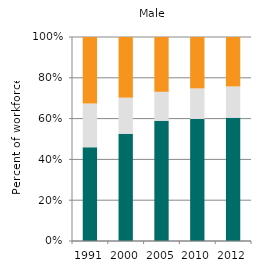
| Category | Agriculture | Industry | Services |
|---|---|---|---|
| 1991.0 | 45.932 | 21.459 | 32.609 |
| 2000.0 | 52.572 | 17.708 | 29.721 |
| 2005.0 | 58.965 | 14.167 | 26.868 |
| 2010.0 | 59.836 | 14.974 | 25.19 |
| 2012.0 | 60.469 | 15.297 | 24.235 |